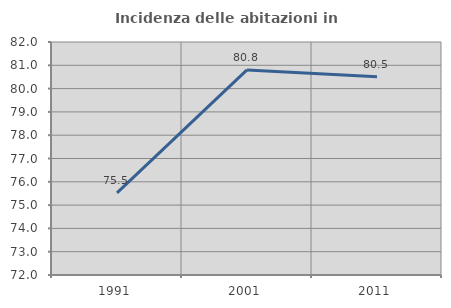
| Category | Incidenza delle abitazioni in proprietà  |
|---|---|
| 1991.0 | 75.524 |
| 2001.0 | 80.8 |
| 2011.0 | 80.508 |